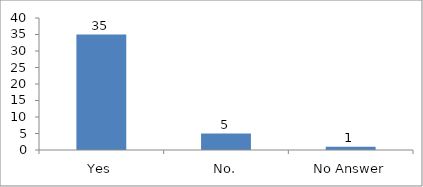
| Category | Was the time allocated for the session sufficient? |
|---|---|
| Yes | 35 |
| No. | 5 |
| No Answer | 1 |